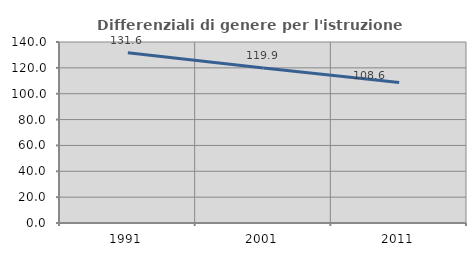
| Category | Differenziali di genere per l'istruzione superiore |
|---|---|
| 1991.0 | 131.615 |
| 2001.0 | 119.855 |
| 2011.0 | 108.609 |